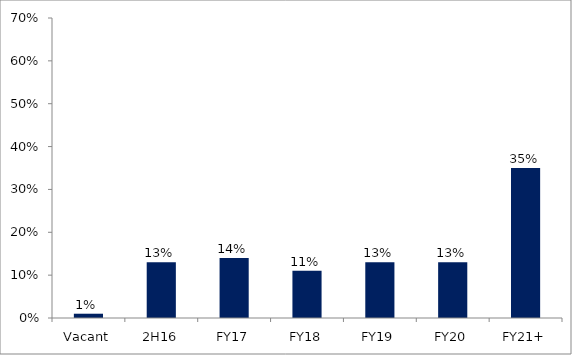
| Category | Series 0 |
|---|---|
| Vacant | 0.01 |
| 2H16 | 0.13 |
| FY17 | 0.14 |
| FY18 | 0.11 |
| FY19 | 0.13 |
| FY20 | 0.13 |
| FY21+ | 0.35 |